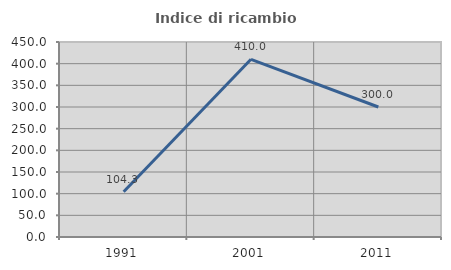
| Category | Indice di ricambio occupazionale  |
|---|---|
| 1991.0 | 104.348 |
| 2001.0 | 410 |
| 2011.0 | 300 |